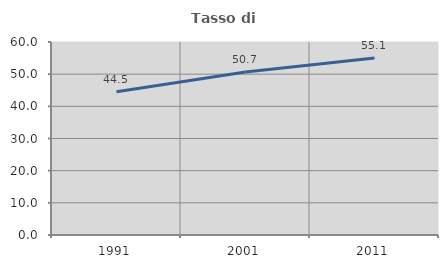
| Category | Tasso di occupazione   |
|---|---|
| 1991.0 | 44.532 |
| 2001.0 | 50.652 |
| 2011.0 | 55.061 |